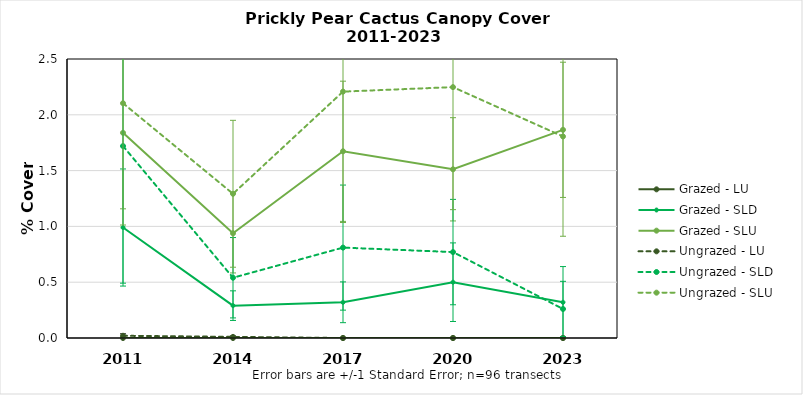
| Category | Grazed - LU | Grazed - SLD | Grazed - SLU | Ungrazed - LU | Ungrazed - SLD | Ungrazed - SLU |
|---|---|---|---|---|---|---|
| 2011.0 | 0 | 0.99 | 1.838 | 0.02 | 1.72 | 2.104 |
| 2014.0 | 0 | 0.29 | 0.938 | 0.01 | 0.54 | 1.292 |
| 2017.0 | 0 | 0.32 | 1.673 | 0 | 0.81 | 2.208 |
| 2020.0 | 0 | 0.5 | 1.512 | 0 | 0.77 | 2.248 |
| 2023.0 | 0 | 0.32 | 1.865 | 0 | 0.26 | 1.806 |